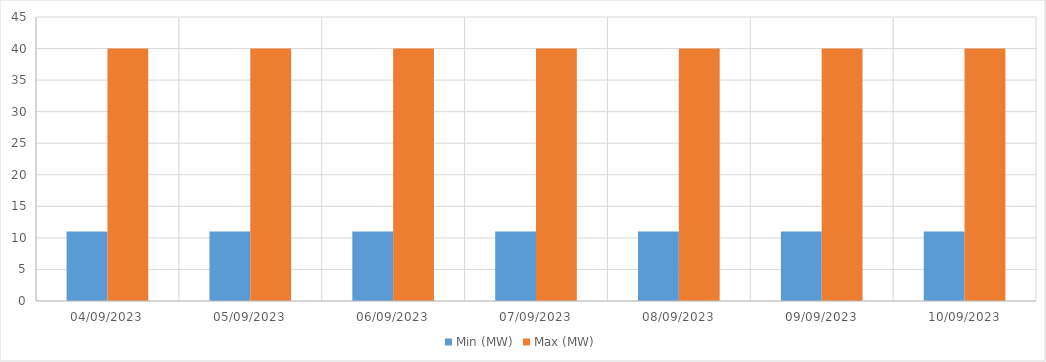
| Category | Min (MW) | Max (MW) |
|---|---|---|
| 04/09/2023 | 11 | 40 |
| 05/09/2023 | 11 | 40 |
| 06/09/2023 | 11 | 40 |
| 07/09/2023 | 11 | 40 |
| 08/09/2023 | 11 | 40 |
| 09/09/2023 | 11 | 40 |
| 10/09/2023 | 11 | 40 |